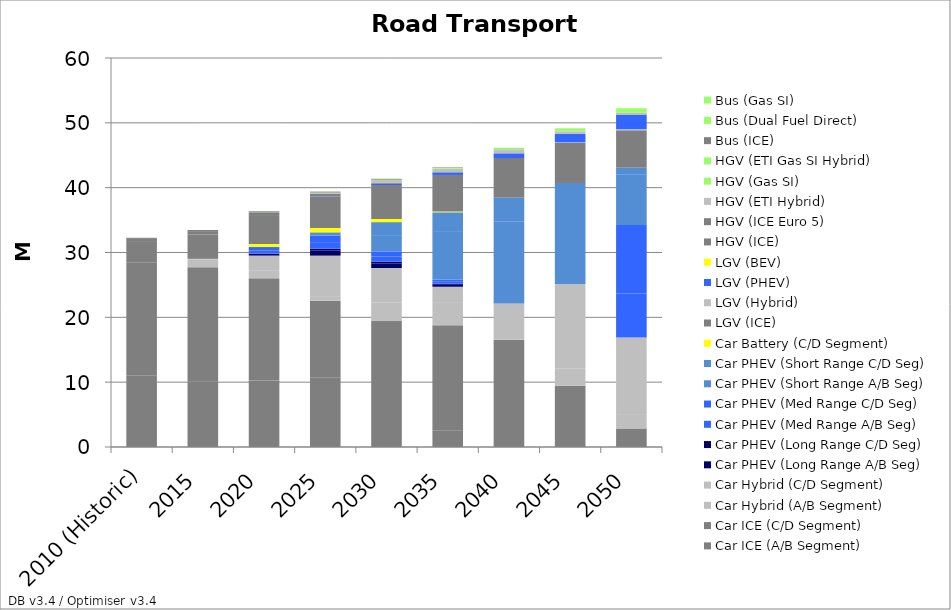
| Category | Car ICE (A/B Segment) | Car ICE (C/D Segment) | Car Hybrid (A/B Segment) | Car Hybrid (C/D Segment) | Car PHEV (Long Range A/B Seg) | Car PHEV (Long Range C/D Seg) | Car PHEV (Med Range A/B Seg) | Car PHEV (Med Range C/D Seg) | Car PHEV (Short Range A/B Seg) | Car PHEV (Short Range C/D Seg) | Car Battery (C/D Segment) | LGV (ICE) | LGV (Hybrid) | LGV (PHEV) | LGV (BEV) | HGV (ICE) | HGV (ICE Euro 5) | HGV (ETI Hybrid) | HGV (Gas SI) | HGV (ETI Gas SI Hybrid) | Bus (ICE) | Bus (Dual Fuel Direct) | Bus (Gas SI) |
|---|---|---|---|---|---|---|---|---|---|---|---|---|---|---|---|---|---|---|---|---|---|---|---|
| 2010 (Historic) | 11.08 | 17.34 | 0 | 0 | 0 | 0 | 0 | 0 | 0 | 0 | 0 | 3.21 | 0 | 0 | 0 | 0.47 | 0 | 0 | 0 | 0 | 0.171 | 0 | 0 |
| 2015 | 10.148 | 17.579 | 1.158 | 0.113 | 0.005 | 0.005 | 0.005 | 0.005 | 0.005 | 0.005 | 0 | 3.736 | 0 | 0 | 0 | 0 | 0.538 | 0 | 0.006 | 0 | 0.161 | 0 | 0.003 |
| 2020 | 10.243 | 15.771 | 1.158 | 2.352 | 0.298 | 0.005 | 0.505 | 0.505 | 0.005 | 0.005 | 0.459 | 4.32 | 0 | 0.01 | 0 | 0 | 0.554 | 0 | 0.018 | 0 | 0.148 | 0 | 0.009 |
| 2025 | 10.67 | 11.901 | 0.695 | 6.253 | 0.796 | 0.282 | 1.003 | 1.003 | 0.003 | 0.503 | 0.651 | 4.807 | 0 | 0.081 | 0 | 0 | 0.398 | 0.166 | 0.018 | 0.02 | 0.137 | 0 | 0.019 |
| 2030 | 6.937 | 12.484 | 2.901 | 5.29 | 0.676 | 0.279 | 0.8 | 0.8 | 2.396 | 2.122 | 0.468 | 5.249 | 0 | 0.207 | 0 | 0 | 0.171 | 0.394 | 0.011 | 0.055 | 0.122 | 0 | 0.033 |
| 2035 | 2.589 | 16.183 | 3.579 | 2.368 | 0.3 | 0.168 | 0.3 | 0.3 | 7.396 | 3.02 | 0.115 | 5.641 | 0 | 0.418 | 0 | 0 | 0 | 0.552 | 0 | 0.116 | 0.09 | 0 | 0.058 |
| 2040 | 0 | 16.552 | 2.419 | 3.182 | 0 | 0 | 0 | 0 | 12.592 | 3.745 | 0 | 6.069 | 0 | 0.737 | 0 | 0 | 0 | 0.504 | 0 | 0.204 | 0.06 | 0 | 0.081 |
| 2045 | 0 | 9.441 | 2.621 | 13.076 | 0 | 0 | 0 | 0 | 13.267 | 2.333 | 0 | 6.191 | 0.064 | 1.299 | 0 | 0 | 0 | 0.39 | 0 | 0.36 | 0.028 | 0.043 | 0.064 |
| 2050 | 0 | 2.863 | 2.214 | 11.804 | 0 | 0 | 6.777 | 10.599 | 7.805 | 1.004 | 0 | 5.772 | 0.175 | 2.289 | 0.064 | 0 | 0 | 0.232 | 0 | 0.558 | 0.001 | 0.095 | 0.033 |